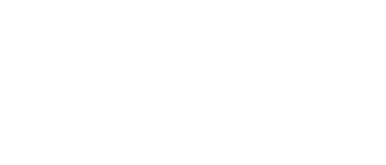
| Category | Series 0 |
|---|---|
| צדקה | 0 |
| מזון | 0 |
| בית | 0 |
| ביגוד | 0 |
| חינוך | 0 |
| רכב | 0 |
| תקשורת  | 0 |
| כללי | 0 |